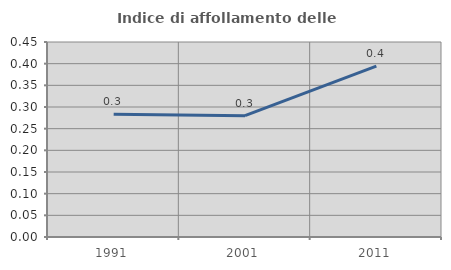
| Category | Indice di affollamento delle abitazioni  |
|---|---|
| 1991.0 | 0.283 |
| 2001.0 | 0.28 |
| 2011.0 | 0.394 |